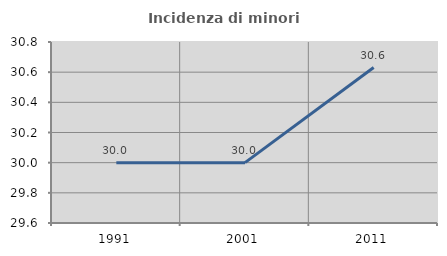
| Category | Incidenza di minori stranieri |
|---|---|
| 1991.0 | 30 |
| 2001.0 | 30 |
| 2011.0 | 30.631 |